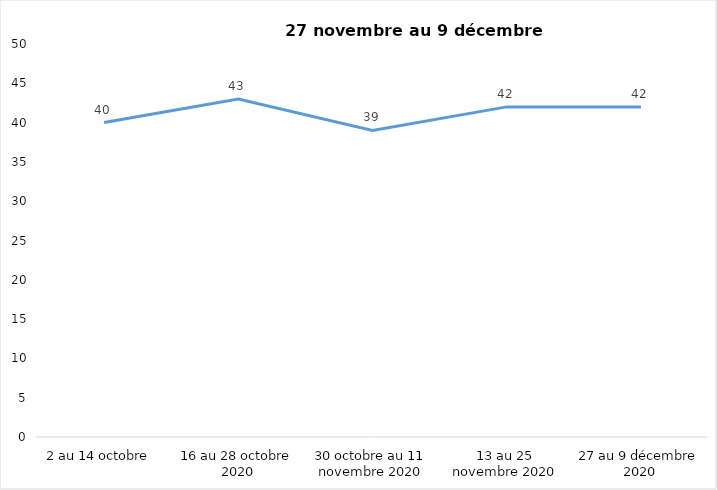
| Category | Series 0 |
|---|---|
| 2 au 14 octobre  | 40 |
| 16 au 28 octobre 2020 | 43 |
| 30 octobre au 11 novembre 2020 | 39 |
| 13 au 25 novembre 2020 | 42 |
| 27 au 9 décembre 2020 | 42 |